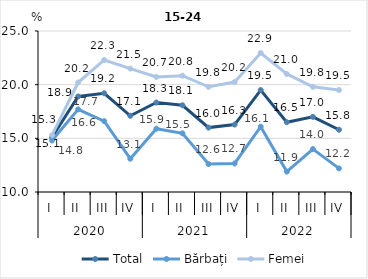
| Category | Total | Bărbați | Femei |
|---|---|---|---|
| 0 | 15.1 | 14.8 | 15.3 |
| 1 | 18.9 | 17.7 | 20.2 |
| 2 | 19.2 | 16.6 | 22.3 |
| 3 | 17.1 | 13.1 | 21.5 |
| 4 | 18.335 | 15.899 | 20.718 |
| 5 | 18.083 | 15.467 | 20.834 |
| 6 | 16 | 12.6 | 19.8 |
| 7 | 16.283 | 12.657 | 20.243 |
| 8 | 19.497 | 16.088 | 22.949 |
| 9 | 16.5 | 11.9 | 21 |
| 10 | 17 | 14 | 19.8 |
| 11 | 15.8 | 12.2 | 19.5 |